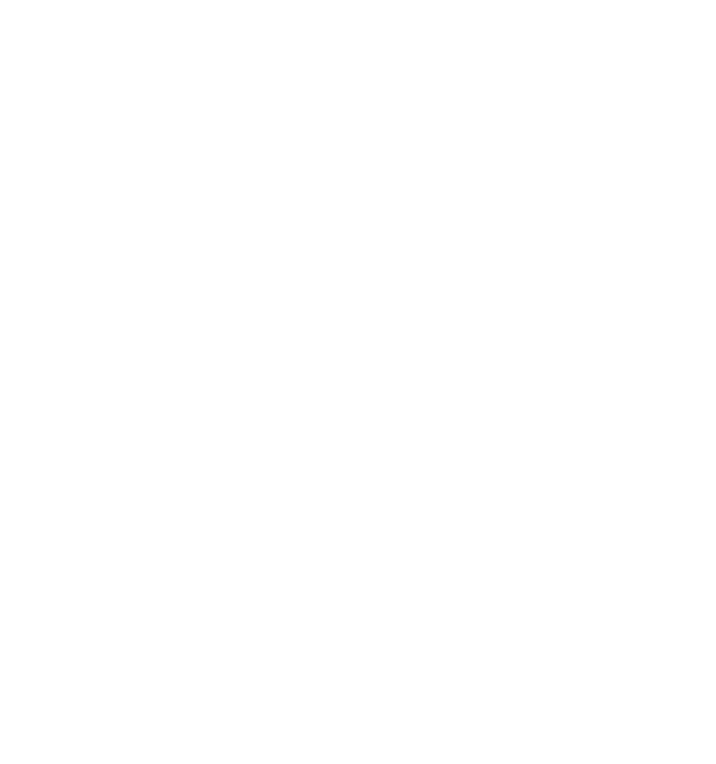
| Category | Series 0 |
|---|---|
| 0.0 | 0 |
| 0.0 | 0 |
| 0.0 | 0 |
| 0.0 | 0 |
| 0.0 | 0 |
| 0.0 | 0 |
| 0.0 | 0 |
| 0.0 | 0 |
| 0.0 | 0 |
| 0.0 | 0 |
| 0.0 | 0 |
| 0.0 | 0 |
| 0.0 | 0 |
| 0.0 | 0 |
| 0.0 | 0 |
| 0.0 | 0 |
| 0.0 | 0 |
| 0.0 | 0 |
| 0.0 | 0 |
| 0.0 | 0 |
| 0.0 | 0 |
| 0.0 | 0 |
| 0.0 | 0 |
| 0.0 | 0 |
| 0.0 | 0 |
| 0.0 | 0 |
| 0.0 | 0 |
| 0.0 | 0 |
| 0.0 | 0 |
| 0.0 | 0 |
| 0.0 | 0 |
| 0.0 | 0 |
| 0.0 | 0 |
| 0.0 | 0 |
| 0.0 | 0 |
| 0.0 | 0 |
| 0.0 | 0 |
| 0.0 | 0 |
| 0.0 | 0 |
| 0.0 | 0 |
| 0.0 | 0 |
| 0.0 | 0 |
| 0.0 | 0 |
| 0.0 | 0 |
| 0.0 | 0 |
| 0.0 | 0 |
| 0.0 | 0 |
| 0.0 | 0 |
| 0.0 | 0 |
| 0.0 | 0 |